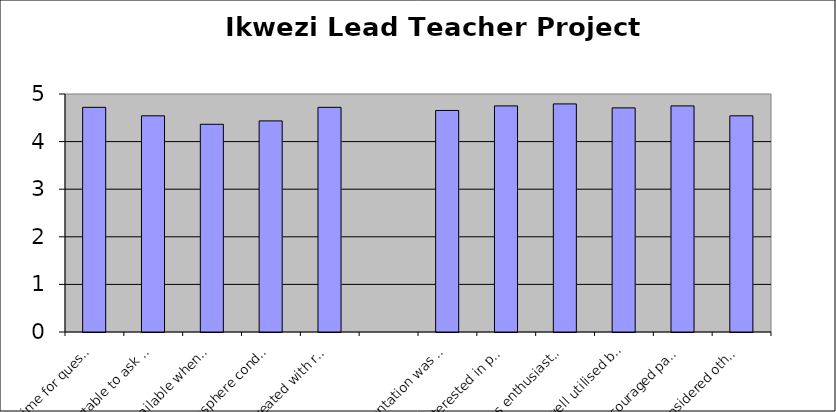
| Category | Series 0 |
|---|---|
| Adequate time for questions | 4.72 |
| Felt comfortable to ask questions | 4.542 |
| Lecturer available when not presenting | 4.364 |
| Class atmosphere conducive to learning | 4.435 |
| Students treated with respect | 4.72 |
|  | 0 |
| Class presentation was well organised | 4.654 |
| Lecturer interested in particpants' learning | 4.75 |
| Lecturer was enthusiastic about content | 4.792 |
| Time was well utilised by lecturer | 4.708 |
| Lecturer encouraged participation | 4.75 |
| Lecturer considered others' viewpoints | 4.542 |